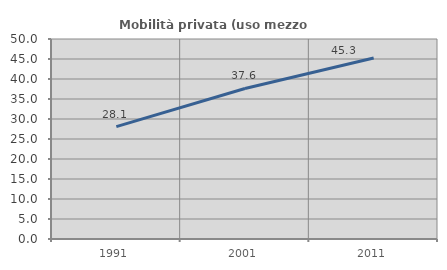
| Category | Mobilità privata (uso mezzo privato) |
|---|---|
| 1991.0 | 28.107 |
| 2001.0 | 37.626 |
| 2011.0 | 45.251 |